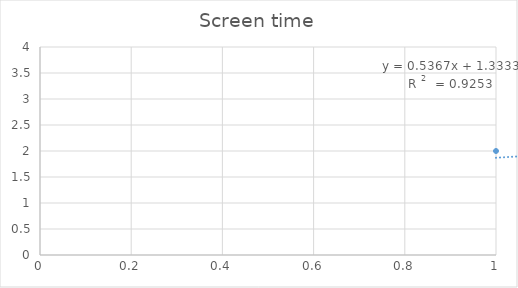
| Category | Series 0 |
|---|---|
| 0 | 2 |
| 1 | 2.333 |
| 2 | 2.7 |
| 3 | 3.667 |